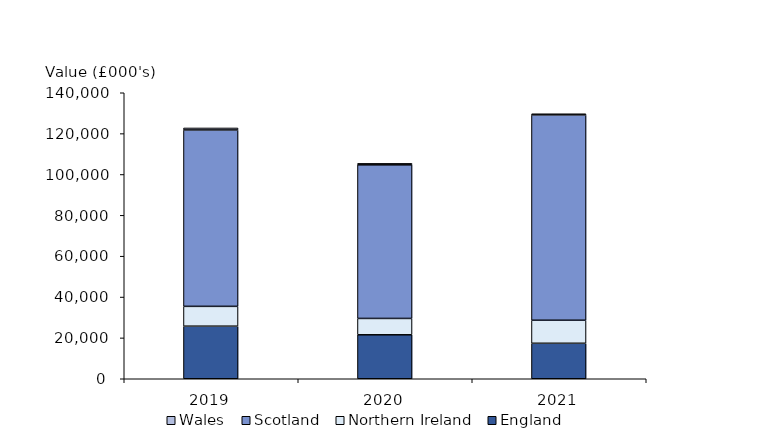
| Category | England | Northern Ireland | Scotland | Wales |
|---|---|---|---|---|
| 2019.0 | 25735.727 | 9706.541 | 86349.543 | 976.333 |
| 2020.0 | 21522.604 | 8004.366 | 75195.573 | 718.274 |
| 2021.0 | 17367.195 | 11269.597 | 100518.613 | 571.022 |